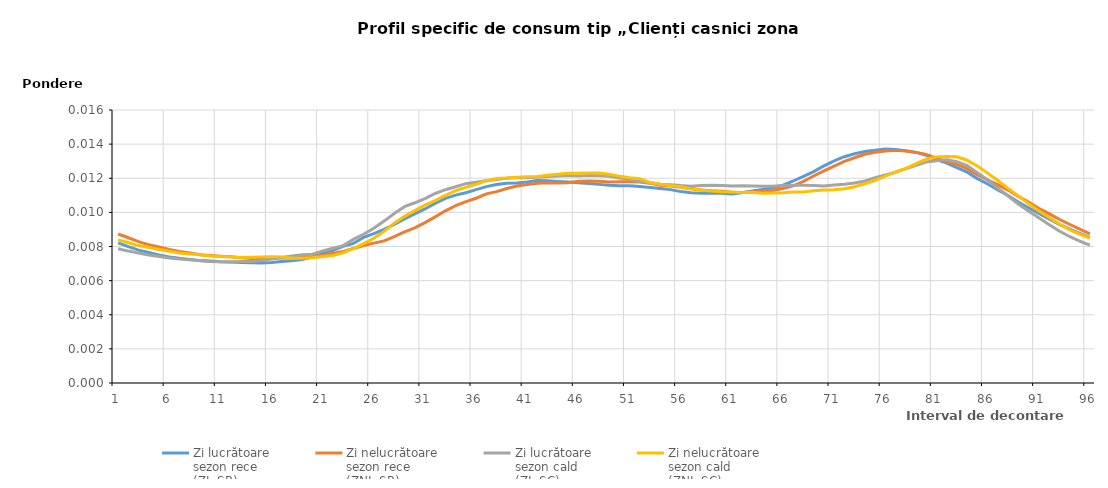
| Category | Zi lucrătoare 
sezon rece
(ZL-SR) | Zi nelucrătoare 
sezon rece
(ZNL-SR) | Zi lucrătoare 
sezon cald
(ZL-SC) | Zi nelucrătoare 
sezon cald
(ZNL-SC) |
|---|---|---|---|---|
| 1.0 | 0.008 | 0.009 | 0.008 | 0.008 |
| 2.0 | 0.008 | 0.009 | 0.008 | 0.008 |
| 3.0 | 0.008 | 0.008 | 0.008 | 0.008 |
| 4.0 | 0.008 | 0.008 | 0.008 | 0.008 |
| 5.0 | 0.008 | 0.008 | 0.007 | 0.008 |
| 6.0 | 0.007 | 0.008 | 0.007 | 0.008 |
| 7.0 | 0.007 | 0.008 | 0.007 | 0.008 |
| 8.0 | 0.007 | 0.008 | 0.007 | 0.008 |
| 9.0 | 0.007 | 0.008 | 0.007 | 0.008 |
| 10.0 | 0.007 | 0.007 | 0.007 | 0.007 |
| 11.0 | 0.007 | 0.007 | 0.007 | 0.007 |
| 12.0 | 0.007 | 0.007 | 0.007 | 0.007 |
| 13.0 | 0.007 | 0.007 | 0.007 | 0.007 |
| 14.0 | 0.007 | 0.007 | 0.007 | 0.007 |
| 15.0 | 0.007 | 0.007 | 0.007 | 0.007 |
| 16.0 | 0.007 | 0.007 | 0.007 | 0.007 |
| 17.0 | 0.007 | 0.007 | 0.007 | 0.007 |
| 18.0 | 0.007 | 0.007 | 0.007 | 0.007 |
| 19.0 | 0.007 | 0.007 | 0.008 | 0.007 |
| 20.0 | 0.007 | 0.007 | 0.008 | 0.007 |
| 21.0 | 0.008 | 0.007 | 0.008 | 0.007 |
| 22.0 | 0.008 | 0.008 | 0.008 | 0.007 |
| 23.0 | 0.008 | 0.008 | 0.008 | 0.008 |
| 24.0 | 0.008 | 0.008 | 0.008 | 0.008 |
| 25.0 | 0.009 | 0.008 | 0.009 | 0.008 |
| 26.0 | 0.009 | 0.008 | 0.009 | 0.008 |
| 27.0 | 0.009 | 0.008 | 0.009 | 0.009 |
| 28.0 | 0.009 | 0.009 | 0.01 | 0.009 |
| 29.0 | 0.01 | 0.009 | 0.01 | 0.01 |
| 30.0 | 0.01 | 0.009 | 0.011 | 0.01 |
| 31.0 | 0.01 | 0.009 | 0.011 | 0.01 |
| 32.0 | 0.011 | 0.01 | 0.011 | 0.011 |
| 33.0 | 0.011 | 0.01 | 0.011 | 0.011 |
| 34.0 | 0.011 | 0.01 | 0.012 | 0.011 |
| 35.0 | 0.011 | 0.011 | 0.012 | 0.011 |
| 36.0 | 0.011 | 0.011 | 0.012 | 0.012 |
| 37.0 | 0.012 | 0.011 | 0.012 | 0.012 |
| 38.0 | 0.012 | 0.011 | 0.012 | 0.012 |
| 39.0 | 0.012 | 0.011 | 0.012 | 0.012 |
| 40.0 | 0.012 | 0.012 | 0.012 | 0.012 |
| 41.0 | 0.012 | 0.012 | 0.012 | 0.012 |
| 42.0 | 0.012 | 0.012 | 0.012 | 0.012 |
| 43.0 | 0.012 | 0.012 | 0.012 | 0.012 |
| 44.0 | 0.012 | 0.012 | 0.012 | 0.012 |
| 45.0 | 0.012 | 0.012 | 0.012 | 0.012 |
| 46.0 | 0.012 | 0.012 | 0.012 | 0.012 |
| 47.0 | 0.012 | 0.012 | 0.012 | 0.012 |
| 48.0 | 0.012 | 0.012 | 0.012 | 0.012 |
| 49.0 | 0.012 | 0.012 | 0.012 | 0.012 |
| 50.0 | 0.012 | 0.012 | 0.012 | 0.012 |
| 51.0 | 0.012 | 0.012 | 0.012 | 0.012 |
| 52.0 | 0.012 | 0.012 | 0.012 | 0.012 |
| 53.0 | 0.011 | 0.012 | 0.012 | 0.012 |
| 54.0 | 0.011 | 0.012 | 0.012 | 0.012 |
| 55.0 | 0.011 | 0.012 | 0.012 | 0.012 |
| 56.0 | 0.011 | 0.011 | 0.012 | 0.012 |
| 57.0 | 0.011 | 0.011 | 0.012 | 0.011 |
| 58.0 | 0.011 | 0.011 | 0.012 | 0.011 |
| 59.0 | 0.011 | 0.011 | 0.012 | 0.011 |
| 60.0 | 0.011 | 0.011 | 0.012 | 0.011 |
| 61.0 | 0.011 | 0.011 | 0.012 | 0.011 |
| 62.0 | 0.011 | 0.011 | 0.012 | 0.011 |
| 63.0 | 0.011 | 0.011 | 0.012 | 0.011 |
| 64.0 | 0.011 | 0.011 | 0.012 | 0.011 |
| 65.0 | 0.011 | 0.011 | 0.012 | 0.011 |
| 66.0 | 0.012 | 0.011 | 0.012 | 0.011 |
| 67.0 | 0.012 | 0.012 | 0.012 | 0.011 |
| 68.0 | 0.012 | 0.012 | 0.012 | 0.011 |
| 69.0 | 0.012 | 0.012 | 0.012 | 0.011 |
| 70.0 | 0.013 | 0.012 | 0.012 | 0.011 |
| 71.0 | 0.013 | 0.013 | 0.012 | 0.011 |
| 72.0 | 0.013 | 0.013 | 0.012 | 0.011 |
| 73.0 | 0.013 | 0.013 | 0.012 | 0.012 |
| 74.0 | 0.014 | 0.013 | 0.012 | 0.012 |
| 75.0 | 0.014 | 0.014 | 0.012 | 0.012 |
| 76.0 | 0.014 | 0.014 | 0.012 | 0.012 |
| 77.0 | 0.014 | 0.014 | 0.012 | 0.012 |
| 78.0 | 0.014 | 0.014 | 0.013 | 0.013 |
| 79.0 | 0.014 | 0.014 | 0.013 | 0.013 |
| 80.0 | 0.013 | 0.013 | 0.013 | 0.013 |
| 81.0 | 0.013 | 0.013 | 0.013 | 0.013 |
| 82.0 | 0.013 | 0.013 | 0.013 | 0.013 |
| 83.0 | 0.013 | 0.013 | 0.013 | 0.013 |
| 84.0 | 0.012 | 0.013 | 0.013 | 0.013 |
| 85.0 | 0.012 | 0.012 | 0.012 | 0.013 |
| 86.0 | 0.012 | 0.012 | 0.012 | 0.012 |
| 87.0 | 0.011 | 0.012 | 0.011 | 0.012 |
| 88.0 | 0.011 | 0.011 | 0.011 | 0.011 |
| 89.0 | 0.011 | 0.011 | 0.01 | 0.011 |
| 90.0 | 0.01 | 0.011 | 0.01 | 0.011 |
| 91.0 | 0.01 | 0.01 | 0.01 | 0.01 |
| 92.0 | 0.01 | 0.01 | 0.009 | 0.01 |
| 93.0 | 0.009 | 0.01 | 0.009 | 0.009 |
| 94.0 | 0.009 | 0.009 | 0.009 | 0.009 |
| 95.0 | 0.009 | 0.009 | 0.008 | 0.009 |
| 96.0 | 0.009 | 0.009 | 0.008 | 0.008 |